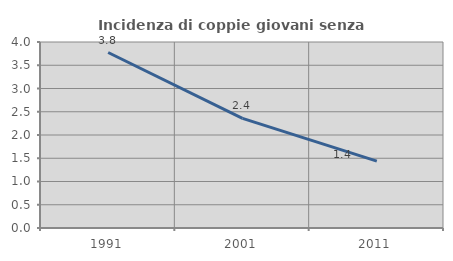
| Category | Incidenza di coppie giovani senza figli |
|---|---|
| 1991.0 | 3.774 |
| 2001.0 | 2.356 |
| 2011.0 | 1.437 |